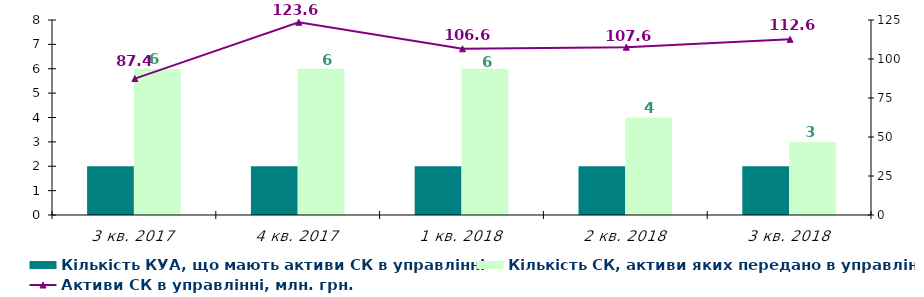
| Category | Кількість КУА, що мають активи СК в управлінні | Кількість СК, активи яких передано в управління |
|---|---|---|
| 3 кв. 2017 | 2 | 6 |
| 4 кв. 2017 | 2 | 6 |
| 1 кв. 2018 | 2 | 6 |
| 2 кв. 2018 | 2 | 4 |
| 3 кв. 2018 | 2 | 3 |